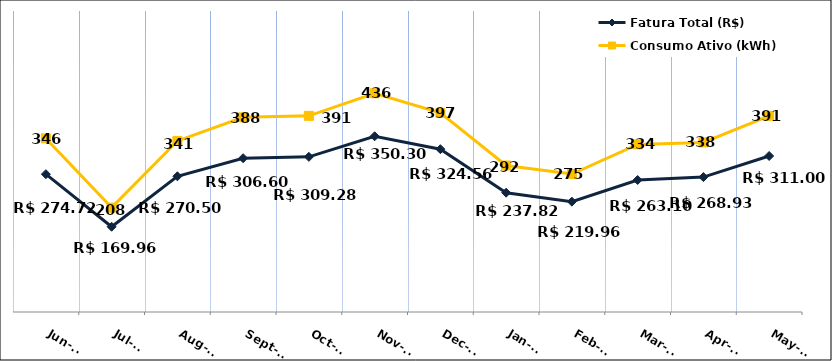
| Category | Fatura Total (R$) |
|---|---|
| 2023-06-01 | 274.72 |
| 2023-07-01 | 169.96 |
| 2023-08-01 | 270.5 |
| 2023-09-01 | 306.6 |
| 2023-10-01 | 309.28 |
| 2023-11-01 | 350.3 |
| 2023-12-01 | 324.56 |
| 2024-01-01 | 237.82 |
| 2024-02-01 | 219.96 |
| 2024-03-01 | 263.1 |
| 2024-04-01 | 268.93 |
| 2024-05-01 | 311 |